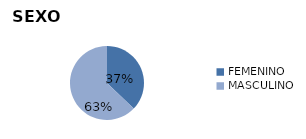
| Category | Series 0 |
|---|---|
| FEMENINO | 1029 |
| MASCULINO | 1741 |